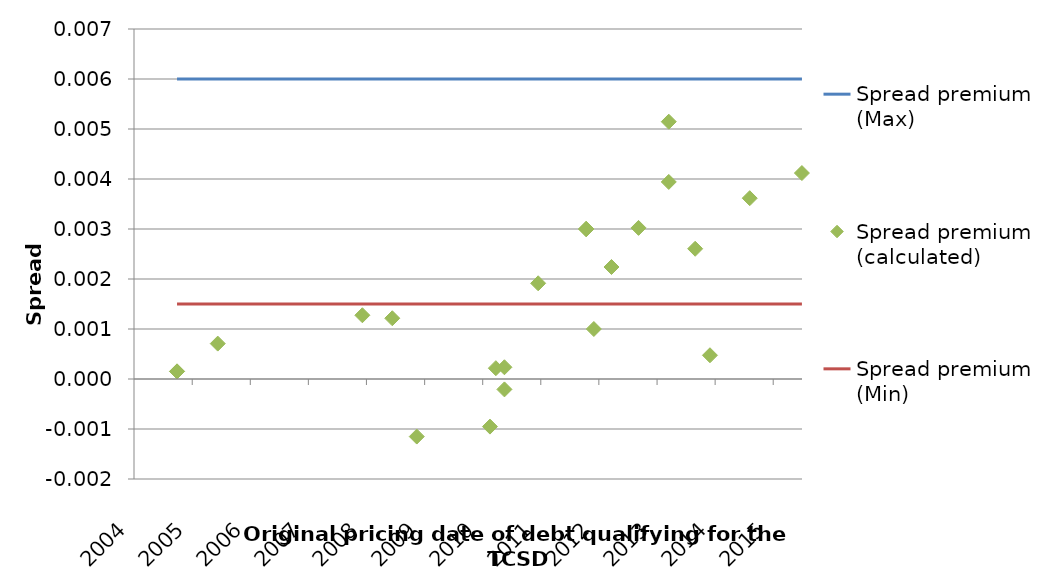
| Category | Spread premium (Max) | Spread premium (calculated) | Spread premium (Min) |
|---|---|---|---|
| 2004-09-27 | 0.006 | 0 | 0.002 |
| 2004-09-27 | 0.006 | 0 | 0.002 |
| 2005-06-10 | 0.006 | 0.001 | 0.002 |
| 2007-12-06 | 0.006 | 0.001 | 0.002 |
| 2008-06-11 | 0.006 | 0.001 | 0.002 |
| 2008-11-12 | 0.006 | -0.001 | 0.002 |
| 2010-02-15 | 0.006 | -0.001 | 0.002 |
| 2010-03-24 | 0.006 | 0 | 0.002 |
| 2010-05-17 | 0.006 | 0 | 0.002 |
| 2010-05-17 | 0.006 | 0 | 0.002 |
| 2010-12-15 | 0.006 | 0.002 | 0.002 |
| 2011-10-13 | 0.006 | 0.003 | 0.002 |
| 2011-10-13 | 0.006 | 0.003 | 0.002 |
| 2011-10-13 | 0.006 | 0.003 | 0.002 |
| 2011-11-30 | 0.006 | 0.001 | 0.002 |
| 2012-03-20 | 0.006 | 0.002 | 0.002 |
| 2012-09-06 | 0.006 | 0.003 | 0.002 |
| 2013-03-15 | 0.006 | 0.004 | 0.002 |
| 2013-03-15 | 0.006 | 0.005 | 0.002 |
| 2013-08-28 | 0.006 | 0.003 | 0.002 |
| 2013-11-29 | 0.006 | 0 | 0.002 |
| 2014-08-06 | 0.006 | 0.004 | 0.002 |
| 2015-06-30 | 0.006 | 0.004 | 0.002 |